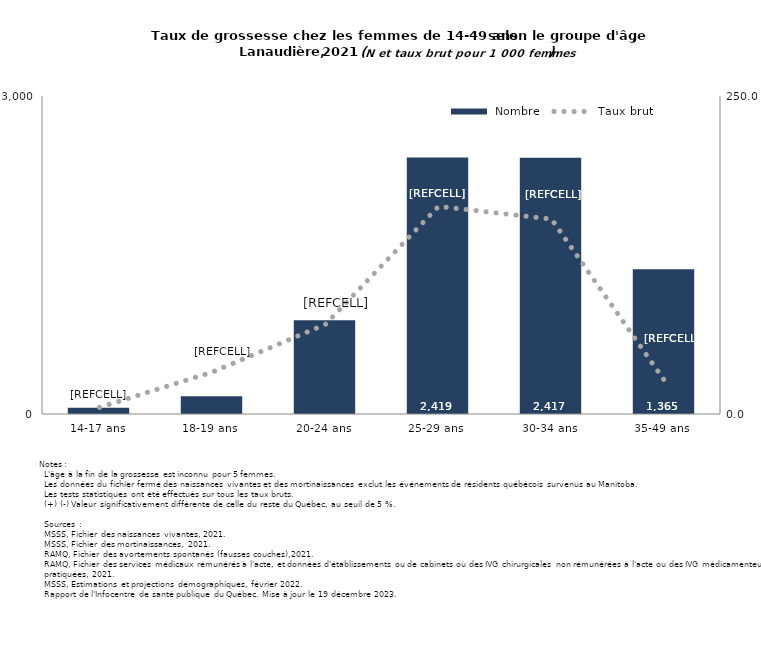
| Category |  Nombre |
|---|---|
| 14-17 ans | 58 |
| 18-19 ans | 168 |
| 20-24 ans | 884 |
| 25-29 ans | 2419 |
| 30-34 ans | 2417 |
| 35-49 ans | 1365 |